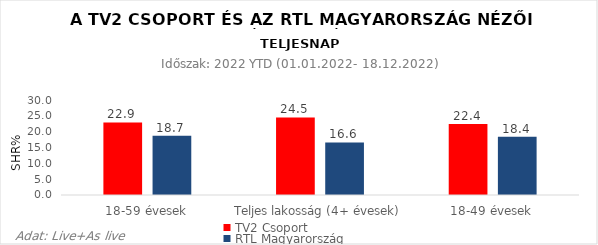
| Category | TV2 Csoport | RTL Magyarország |
|---|---|---|
| 18-59 évesek | 22.9 | 18.7 |
| Teljes lakosság (4+ évesek) | 24.5 | 16.6 |
| 18-49 évesek | 22.4 | 18.4 |